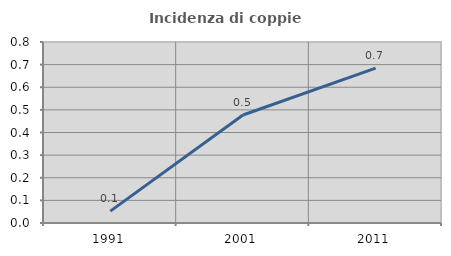
| Category | Incidenza di coppie miste |
|---|---|
| 1991.0 | 0.052 |
| 2001.0 | 0.477 |
| 2011.0 | 0.685 |